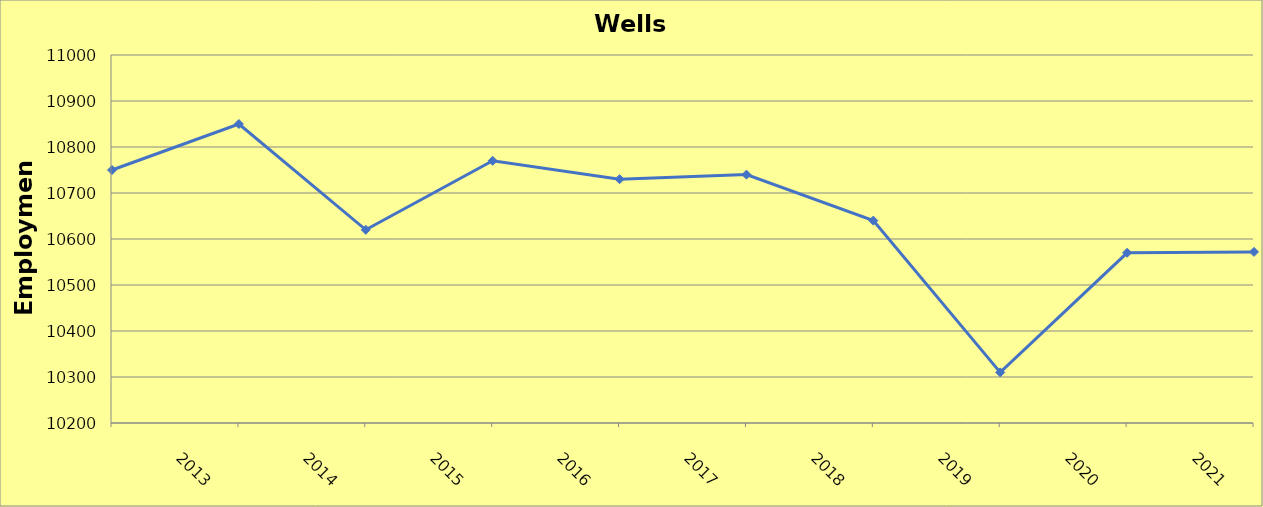
| Category | Wells County |
|---|---|
| 2013.0 | 10750 |
| 2014.0 | 10850 |
| 2015.0 | 10620 |
| 2016.0 | 10770 |
| 2017.0 | 10730 |
| 2018.0 | 10740 |
| 2019.0 | 10640 |
| 2020.0 | 10310 |
| 2021.0 | 10570 |
| 2022.0 | 10572 |